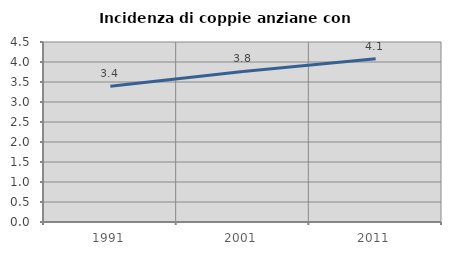
| Category | Incidenza di coppie anziane con figli |
|---|---|
| 1991.0 | 3.395 |
| 2001.0 | 3.764 |
| 2011.0 | 4.078 |